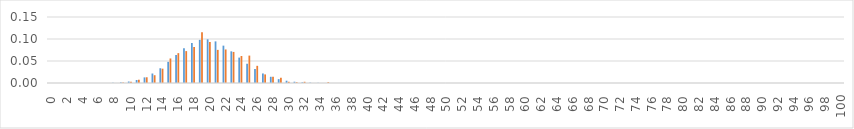
| Category | prob | rel freq |
|---|---|---|
| 0.0 | 0 | 0 |
| 1.0 | 0 | 0 |
| 2.0 | 0 | 0 |
| 3.0 | 0 | 0 |
| 4.0 | 0 | 0 |
| 5.0 | 0 | 0 |
| 6.0 | 0 | 0 |
| 7.0 | 0 | 0 |
| 8.0 | 0.001 | 0 |
| 9.0 | 0.001 | 0.001 |
| 10.0 | 0.003 | 0.003 |
| 11.0 | 0.007 | 0.007 |
| 12.0 | 0.013 | 0.013 |
| 13.0 | 0.022 | 0.018 |
| 14.0 | 0.034 | 0.033 |
| 15.0 | 0.048 | 0.056 |
| 16.0 | 0.064 | 0.068 |
| 17.0 | 0.079 | 0.072 |
| 18.0 | 0.091 | 0.082 |
| 19.0 | 0.098 | 0.115 |
| 20.0 | 0.099 | 0.093 |
| 21.0 | 0.095 | 0.075 |
| 22.0 | 0.085 | 0.076 |
| 23.0 | 0.072 | 0.071 |
| 24.0 | 0.058 | 0.061 |
| 25.0 | 0.044 | 0.062 |
| 26.0 | 0.032 | 0.039 |
| 27.0 | 0.022 | 0.02 |
| 28.0 | 0.014 | 0.014 |
| 29.0 | 0.009 | 0.012 |
| 30.0 | 0.005 | 0.003 |
| 31.0 | 0.003 | 0.002 |
| 32.0 | 0.002 | 0.003 |
| 33.0 | 0.001 | 0 |
| 34.0 | 0 | 0 |
| 35.0 | 0 | 0.002 |
| 36.0 | 0 | 0 |
| 37.0 | 0 | 0 |
| 38.0 | 0 | 0 |
| 39.0 | 0 | 0 |
| 40.0 | 0 | 0 |
| 41.0 | 0 | 0 |
| 42.0 | 0 | 0 |
| 43.0 | 0 | 0 |
| 44.0 | 0 | 0 |
| 45.0 | 0 | 0 |
| 46.0 | 0 | 0 |
| 47.0 | 0 | 0 |
| 48.0 | 0 | 0 |
| 49.0 | 0 | 0 |
| 50.0 | 0 | 0 |
| 51.0 | 0 | 0 |
| 52.0 | 0 | 0 |
| 53.0 | 0 | 0 |
| 54.0 | 0 | 0 |
| 55.0 | 0 | 0 |
| 56.0 | 0 | 0 |
| 57.0 | 0 | 0 |
| 58.0 | 0 | 0 |
| 59.0 | 0 | 0 |
| 60.0 | 0 | 0 |
| 61.0 | 0 | 0 |
| 62.0 | 0 | 0 |
| 63.0 | 0 | 0 |
| 64.0 | 0 | 0 |
| 65.0 | 0 | 0 |
| 66.0 | 0 | 0 |
| 67.0 | 0 | 0 |
| 68.0 | 0 | 0 |
| 69.0 | 0 | 0 |
| 70.0 | 0 | 0 |
| 71.0 | 0 | 0 |
| 72.0 | 0 | 0 |
| 73.0 | 0 | 0 |
| 74.0 | 0 | 0 |
| 75.0 | 0 | 0 |
| 76.0 | 0 | 0 |
| 77.0 | 0 | 0 |
| 78.0 | 0 | 0 |
| 79.0 | 0 | 0 |
| 80.0 | 0 | 0 |
| 81.0 | 0 | 0 |
| 82.0 | 0 | 0 |
| 83.0 | 0 | 0 |
| 84.0 | 0 | 0 |
| 85.0 | 0 | 0 |
| 86.0 | 0 | 0 |
| 87.0 | 0 | 0 |
| 88.0 | 0 | 0 |
| 89.0 | 0 | 0 |
| 90.0 | 0 | 0 |
| 91.0 | 0 | 0 |
| 92.0 | 0 | 0 |
| 93.0 | 0 | 0 |
| 94.0 | 0 | 0 |
| 95.0 | 0 | 0 |
| 96.0 | 0 | 0 |
| 97.0 | 0 | 0 |
| 98.0 | 0 | 0 |
| 99.0 | 0 | 0 |
| 100.0 | 0 | 0 |